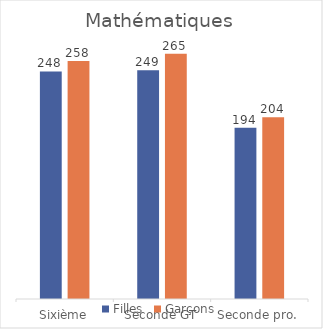
| Category | Filles | Garçons |
|---|---|---|
| Sixième | 248 | 258 |
| Seconde GT | 249 | 265 |
| Seconde pro. | 194 | 204 |